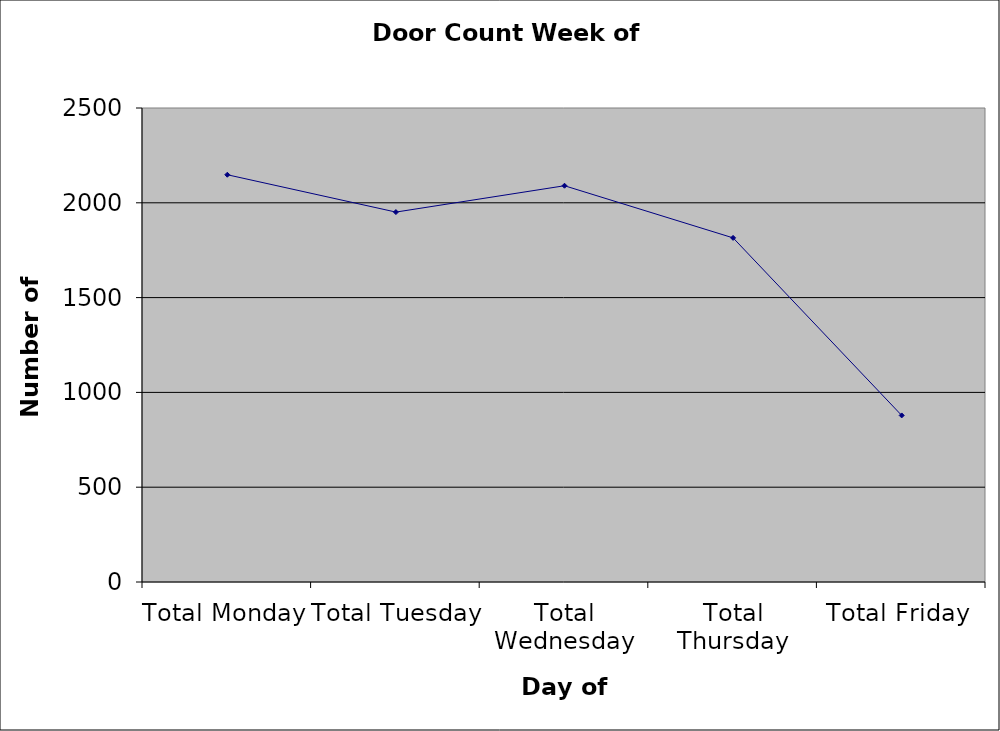
| Category | Series 0 |
|---|---|
| Total Monday | 2148 |
| Total Tuesday | 1951 |
| Total Wednesday | 2090 |
| Total Thursday | 1815 |
| Total Friday | 878.5 |